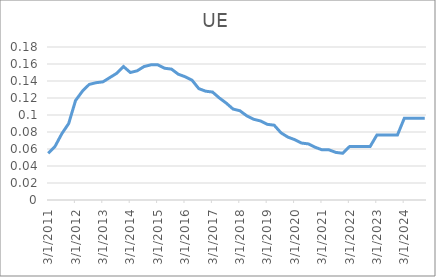
| Category | UE | GDP |
|---|---|---|
| 3/31/11 | 0.055 |  |
| 6/30/11 | 0.063 |  |
| 9/30/11 | 0.078 |  |
| 12/31/11 | 0.09 |  |
| 3/31/12 | 0.117 |  |
| 6/30/12 | 0.128 |  |
| 9/30/12 | 0.136 |  |
| 12/31/12 | 0.138 |  |
| 3/31/13 | 0.139 |  |
| 6/30/13 | 0.144 |  |
| 9/30/13 | 0.149 |  |
| 12/31/13 | 0.157 |  |
| 3/31/14 | 0.15 |  |
| 6/30/14 | 0.152 |  |
| 9/30/14 | 0.157 |  |
| 12/31/14 | 0.159 |  |
| 3/31/15 | 0.159 |  |
| 6/30/15 | 0.155 |  |
| 9/30/15 | 0.154 |  |
| 12/31/15 | 0.148 |  |
| 3/31/16 | 0.145 |  |
| 6/30/16 | 0.141 |  |
| 9/30/16 | 0.131 |  |
| 12/31/16 | 0.128 |  |
| 3/31/17 | 0.127 |  |
| 6/30/17 | 0.12 |  |
| 9/30/17 | 0.114 |  |
| 12/31/17 | 0.107 |  |
| 3/31/18 | 0.105 |  |
| 6/30/18 | 0.099 |  |
| 9/30/18 | 0.095 |  |
| 12/31/18 | 0.093 |  |
| 3/31/19 | 0.089 |  |
| 6/30/19 | 0.088 |  |
| 9/30/19 | 0.079 |  |
| 12/31/19 | 0.074 |  |
| 3/31/20 | 0.071 |  |
| 6/30/20 | 0.067 |  |
| 9/30/20 | 0.066 |  |
| 12/31/20 | 0.062 |  |
| 3/31/21 | 0.059 |  |
| 6/30/21 | 0.059 |  |
| 9/30/21 | 0.056 |  |
| 12/31/21 | 0.055 |  |
| 3/31/22 | 0.063 |  |
| 6/30/22 | 0.063 |  |
| 9/30/22 | 0.063 |  |
| 12/31/22 | 0.063 |  |
| 3/31/23 | 0.076 |  |
| 6/30/23 | 0.076 |  |
| 9/30/23 | 0.076 |  |
| 12/31/23 | 0.076 |  |
| 3/31/24 | 0.096 |  |
| 6/30/24 | 0.096 |  |
| 9/30/24 | 0.096 |  |
| 12/31/24 | 0.096 |  |